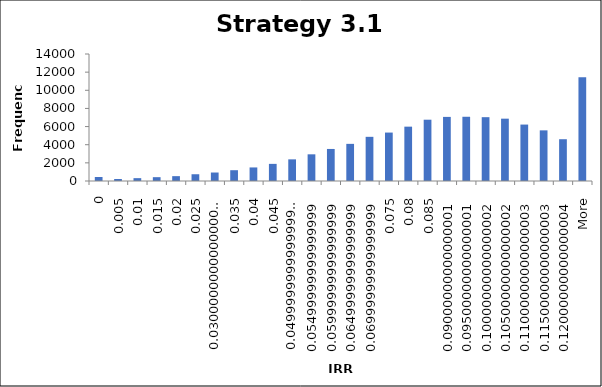
| Category | Frequency |
|---|---|
| 0 | 441 |
| 0.005 | 222 |
| 0.01 | 314 |
| 0.015 | 422 |
| 0.02 | 535 |
| 0.025 | 745 |
| 0.03 | 935 |
| 0.035 | 1190 |
| 0.04 | 1495 |
| 0.045 | 1888 |
| 0.05 | 2386 |
| 0.055 | 2941 |
| 0.06 | 3532 |
| 0.065 | 4094 |
| 0.07 | 4869 |
| 0.075 | 5339 |
| 0.08 | 5991 |
| 0.085 | 6757 |
| 0.09 | 7066 |
| 0.095 | 7081 |
| 0.1 | 7036 |
| 0.105 | 6871 |
| 0.11 | 6221 |
| 0.115 | 5583 |
| 0.12 | 4606 |
| More | 11442 |